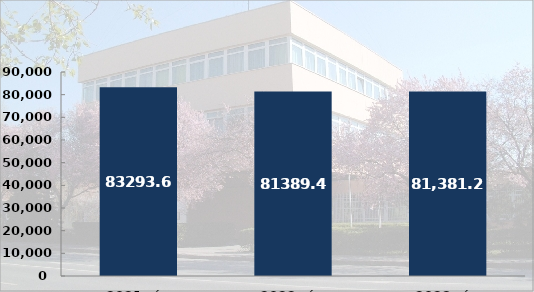
| Category | Rendészeti állomány tényleges közterületi szolgálati idő (óra) |
|---|---|
| 2021. év | 83293.67 |
| 2022. év | 81389.48 |
| 2023. év | 81381.29 |